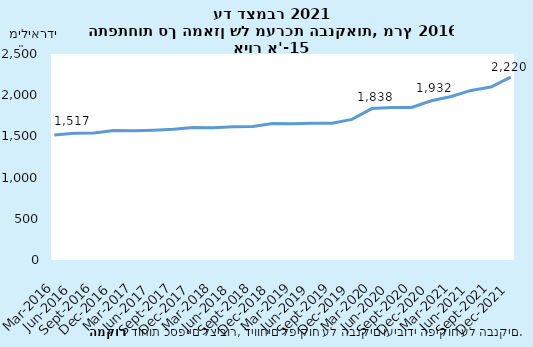
| Category | Series 0 |
|---|---|
| 2016-03-31 | 1516.618 |
| 2016-06-30 | 1537.091 |
| 2016-09-30 | 1541.227 |
| 2016-12-31 | 1570.312 |
| 2017-03-31 | 1569.623 |
| 2017-06-30 | 1575.677 |
| 2017-09-30 | 1585.666 |
| 2017-12-31 | 1607.805 |
| 2018-03-31 | 1604.683 |
| 2018-06-30 | 1616.942 |
| 2018-09-30 | 1619.425 |
| 2018-12-31 | 1655.799 |
| 2019-03-31 | 1653.089 |
| 2019-06-30 | 1660.785 |
| 2019-09-30 | 1658.994 |
| 2019-12-31 | 1706.231 |
| 2020-03-31 | 1837.559 |
| 2020-06-30 | 1849.815 |
| 2020-09-30 | 1850.688 |
| 2020-12-31 | 1932.424 |
| 2021-03-31 | 1985.043 |
| 2021-06-30 | 2057.981 |
| 2021-09-30 | 2099.074 |
| 2021-12-31 | 2219.901 |